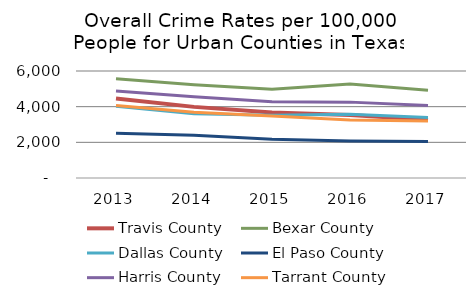
| Category | Travis County | Bexar County | Dallas County | El Paso County | Harris County | Tarrant County |
|---|---|---|---|---|---|---|
| 2013.0 | 4453.7 | 5559.4 | 4023.3 | 2514.5 | 4874.3 | 4066.1 |
| 2014.0 | 3988.318 | 5223.989 | 3600.013 | 2393.065 | 4550.263 | 3691.548 |
| 2015.0 | 3677 | 4972 | 3514.5 | 2175.8 | 4282 | 3470.9 |
| 2016.0 | 3526.2 | 5275.1 | 3568.4 | 2077.6 | 4254.6 | 3252.7 |
| 2017.0 | 3270 | 4920 | 3390.1 | 2049.5 | 4070.7 | 3201.5 |